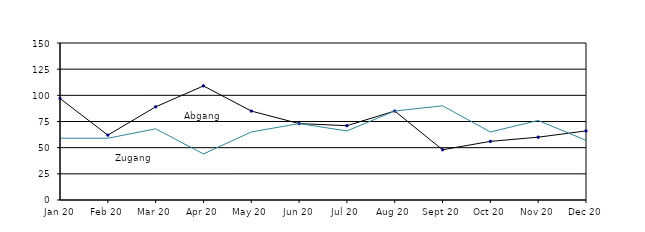
| Category | Zugang | Abgang |
|---|---|---|
| 2020-01-01 | 97 | 59 |
| 2020-02-01 | 62 | 59 |
| 2020-03-01 | 89 | 68 |
| 2020-04-01 | 109 | 44 |
| 2020-05-01 | 85 | 65 |
| 2020-06-01 | 73 | 73 |
| 2020-07-01 | 71 | 66 |
| 2020-08-01 | 85 | 85 |
| 2020-09-01 | 48 | 90 |
| 2020-10-01 | 56 | 65 |
| 2020-11-01 | 60 | 76 |
| 2020-12-01 | 66 | 57 |